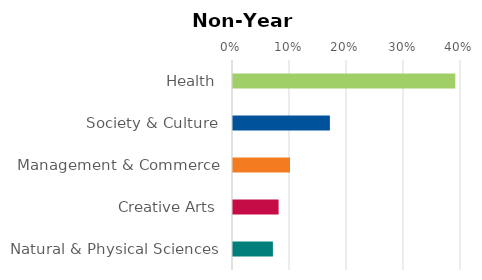
| Category | Series 0 |
|---|---|
| Health | 0.39 |
| Society & Culture | 0.17 |
| Management & Commerce | 0.1 |
| Creative Arts | 0.08 |
| Natural & Physical Sciences | 0.07 |